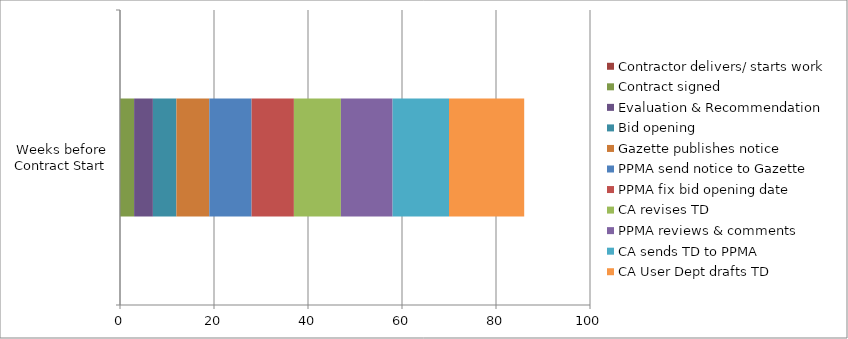
| Category | Contractor delivers/ starts work | Contract signed | Evaluation & Recommendation | Bid opening | Gazette publishes notice | PPMA send notice to Gazette | PPMA fix bid opening date | CA revises TD | PPMA reviews & comments | CA sends TD to PPMA | CA User Dept drafts TD |
|---|---|---|---|---|---|---|---|---|---|---|---|
| Weeks before Contract Start | 0 | 3 | 4 | 5 | 7 | 9 | 9 | 10 | 11 | 12 | 16 |